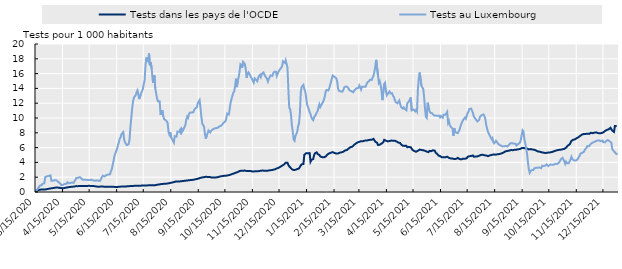
| Category | Tests dans les pays de l'OCDE | Tests au Luxembourg |
|---|---|---|
| 3/15/20 | 0.126 | 0.118 |
| 3/16/20 | 0.172 | 0.197 |
| 3/17/20 | 0.209 | 0.323 |
| 3/18/20 | 0.256 | 0.514 |
| 3/19/20 | 0.288 | 0.677 |
| 3/20/20 | 0.306 | 0.86 |
| 3/21/20 | 0.323 | 0.937 |
| 3/22/20 | 0.329 | 0.939 |
| 3/23/20 | 0.321 | 1.106 |
| 3/24/20 | 0.334 | 1.175 |
| 3/25/20 | 0.335 | 1.18 |
| 3/26/20 | 0.343 | 2.012 |
| 3/27/20 | 0.364 | 2.031 |
| 3/28/20 | 0.386 | 2.119 |
| 3/29/20 | 0.412 | 2.175 |
| 3/30/20 | 0.437 | 2.168 |
| 3/31/20 | 0.46 | 2.18 |
| 4/1/20 | 0.473 | 2.243 |
| 4/2/20 | 0.498 | 1.511 |
| 4/3/20 | 0.506 | 1.539 |
| 4/4/20 | 0.531 | 1.539 |
| 4/5/20 | 0.565 | 1.602 |
| 4/6/20 | 0.577 | 1.596 |
| 4/7/20 | 0.58 | 1.615 |
| 4/8/20 | 0.625 | 1.56 |
| 4/9/20 | 0.594 | 1.452 |
| 4/10/20 | 0.581 | 1.334 |
| 4/11/20 | 0.571 | 1.219 |
| 4/12/20 | 0.541 | 1.142 |
| 4/13/20 | 0.531 | 0.923 |
| 4/14/20 | 0.52 | 1.003 |
| 4/15/20 | 0.514 | 0.983 |
| 4/16/20 | 0.524 | 1.003 |
| 4/17/20 | 0.556 | 1.081 |
| 4/18/20 | 0.583 | 1.131 |
| 4/19/20 | 0.594 | 1.126 |
| 4/20/20 | 0.614 | 1.317 |
| 4/21/20 | 0.64 | 1.178 |
| 4/22/20 | 0.672 | 1.244 |
| 4/23/20 | 0.68 | 1.207 |
| 4/24/20 | 0.694 | 1.27 |
| 4/25/20 | 0.701 | 1.287 |
| 4/26/20 | 0.718 | 1.274 |
| 4/27/20 | 0.729 | 1.235 |
| 4/28/20 | 0.747 | 1.454 |
| 4/29/20 | 0.764 | 1.621 |
| 4/30/20 | 0.795 | 1.886 |
| 5/1/20 | 0.8 | 1.904 |
| 5/2/20 | 0.793 | 1.923 |
| 5/3/20 | 0.79 | 1.947 |
| 5/4/20 | 0.811 | 2.01 |
| 5/5/20 | 0.81 | 1.909 |
| 5/6/20 | 0.809 | 1.807 |
| 5/7/20 | 0.804 | 1.662 |
| 5/8/20 | 0.806 | 1.645 |
| 5/9/20 | 0.827 | 1.652 |
| 5/10/20 | 0.827 | 1.646 |
| 5/11/20 | 0.815 | 1.649 |
| 5/12/20 | 0.824 | 1.675 |
| 5/13/20 | 0.828 | 1.624 |
| 5/14/20 | 0.83 | 1.618 |
| 5/15/20 | 0.838 | 1.61 |
| 5/16/20 | 0.826 | 1.673 |
| 5/17/20 | 0.828 | 1.659 |
| 5/18/20 | 0.824 | 1.646 |
| 5/19/20 | 0.818 | 1.574 |
| 5/20/20 | 0.8 | 1.643 |
| 5/21/20 | 0.771 | 1.528 |
| 5/22/20 | 0.752 | 1.511 |
| 5/23/20 | 0.734 | 1.556 |
| 5/24/20 | 0.726 | 1.544 |
| 5/25/20 | 0.725 | 1.533 |
| 5/26/20 | 0.723 | 1.593 |
| 5/27/20 | 0.723 | 1.523 |
| 5/28/20 | 0.736 | 1.796 |
| 5/29/20 | 0.737 | 2.023 |
| 5/30/20 | 0.732 | 2.204 |
| 5/31/20 | 0.735 | 2.226 |
| 6/1/20 | 0.713 | 2.108 |
| 6/2/20 | 0.701 | 2.168 |
| 6/3/20 | 0.691 | 2.289 |
| 6/4/20 | 0.695 | 2.215 |
| 6/5/20 | 0.702 | 2.363 |
| 6/6/20 | 0.703 | 2.319 |
| 6/7/20 | 0.71 | 2.39 |
| 6/8/20 | 0.713 | 2.799 |
| 6/9/20 | 0.704 | 3.028 |
| 6/10/20 | 0.703 | 3.645 |
| 6/11/20 | 0.695 | 4.174 |
| 6/12/20 | 0.688 | 4.868 |
| 6/13/20 | 0.688 | 5.217 |
| 6/14/20 | 0.684 | 5.254 |
| 6/15/20 | 0.681 | 5.825 |
| 6/16/20 | 0.69 | 6.328 |
| 6/17/20 | 0.705 | 6.723 |
| 6/18/20 | 0.719 | 7.204 |
| 6/19/20 | 0.726 | 7.393 |
| 6/20/20 | 0.732 | 7.85 |
| 6/21/20 | 0.734 | 7.813 |
| 6/22/20 | 0.749 | 8.098 |
| 6/23/20 | 0.752 | 7.041 |
| 6/24/20 | 0.75 | 6.689 |
| 6/25/20 | 0.752 | 6.49 |
| 6/26/20 | 0.763 | 6.342 |
| 6/27/20 | 0.773 | 6.37 |
| 6/28/20 | 0.779 | 6.466 |
| 6/29/20 | 0.789 | 7.046 |
| 6/30/20 | 0.808 | 8.751 |
| 7/1/20 | 0.819 | 9.982 |
| 7/2/20 | 0.825 | 11.287 |
| 7/3/20 | 0.825 | 12.271 |
| 7/4/20 | 0.825 | 12.774 |
| 7/5/20 | 0.831 | 12.791 |
| 7/6/20 | 0.834 | 13.087 |
| 7/7/20 | 0.828 | 13.486 |
| 7/8/20 | 0.829 | 13.741 |
| 7/9/20 | 0.833 | 13.727 |
| 7/10/20 | 0.843 | 12.556 |
| 7/11/20 | 0.852 | 12.539 |
| 7/12/20 | 0.858 | 13.327 |
| 7/13/20 | 0.868 | 13.423 |
| 7/14/20 | 0.869 | 13.877 |
| 7/15/20 | 0.872 | 14.537 |
| 7/16/20 | 0.878 | 15.049 |
| 7/17/20 | 0.882 | 17.071 |
| 7/18/20 | 0.885 | 18.174 |
| 7/19/20 | 0.889 | 17.845 |
| 7/20/20 | 0.911 | 17.676 |
| 7/21/20 | 0.911 | 18.728 |
| 7/22/20 | 0.907 | 17.111 |
| 7/23/20 | 0.909 | 17.519 |
| 7/24/20 | 0.909 | 16.654 |
| 7/25/20 | 0.909 | 15.176 |
| 7/26/20 | 0.913 | 14.726 |
| 7/27/20 | 0.894 | 15.768 |
| 7/28/20 | 0.905 | 14.003 |
| 7/29/20 | 0.948 | 13.908 |
| 7/30/20 | 0.973 | 12.687 |
| 7/31/20 | 1 | 12.268 |
| 8/1/20 | 1.012 | 12.29 |
| 8/2/20 | 1.028 | 12.249 |
| 8/3/20 | 1.055 | 10.428 |
| 8/4/20 | 1.082 | 10.293 |
| 8/5/20 | 1.081 | 11.046 |
| 8/6/20 | 1.097 | 10.257 |
| 8/7/20 | 1.112 | 9.866 |
| 8/8/20 | 1.117 | 9.803 |
| 8/9/20 | 1.127 | 9.686 |
| 8/10/20 | 1.134 | 9.537 |
| 8/11/20 | 1.156 | 9.272 |
| 8/12/20 | 1.172 | 8.092 |
| 8/13/20 | 1.188 | 7.747 |
| 8/14/20 | 1.22 | 8.089 |
| 8/15/20 | 1.258 | 7.342 |
| 8/16/20 | 1.281 | 7.374 |
| 8/17/20 | 1.309 | 6.901 |
| 8/18/20 | 1.334 | 6.679 |
| 8/19/20 | 1.381 | 7.539 |
| 8/20/20 | 1.407 | 7.613 |
| 8/21/20 | 1.419 | 7.484 |
| 8/22/20 | 1.421 | 8.166 |
| 8/23/20 | 1.416 | 8.281 |
| 8/24/20 | 1.428 | 8.138 |
| 8/25/20 | 1.442 | 8.388 |
| 8/26/20 | 1.444 | 7.796 |
| 8/27/20 | 1.469 | 8.503 |
| 8/28/20 | 1.482 | 8.287 |
| 8/29/20 | 1.5 | 8.525 |
| 8/30/20 | 1.51 | 8.514 |
| 8/31/20 | 1.536 | 9.069 |
| 9/1/20 | 1.541 | 9.819 |
| 9/2/20 | 1.557 | 10.186 |
| 9/3/20 | 1.572 | 10.025 |
| 9/4/20 | 1.593 | 10.554 |
| 9/5/20 | 1.603 | 10.721 |
| 9/6/20 | 1.614 | 10.765 |
| 9/7/20 | 1.619 | 10.743 |
| 9/8/20 | 1.644 | 10.743 |
| 9/9/20 | 1.659 | 10.783 |
| 9/10/20 | 1.677 | 11.113 |
| 9/11/20 | 1.711 | 11.287 |
| 9/12/20 | 1.743 | 11.391 |
| 9/13/20 | 1.769 | 11.449 |
| 9/14/20 | 1.797 | 12.03 |
| 9/15/20 | 1.824 | 12.147 |
| 9/16/20 | 1.862 | 12.421 |
| 9/17/20 | 1.912 | 11.373 |
| 9/18/20 | 1.95 | 10.179 |
| 9/19/20 | 1.97 | 9.244 |
| 9/20/20 | 1.984 | 9.116 |
| 9/21/20 | 2.009 | 8.823 |
| 9/22/20 | 2.05 | 7.834 |
| 9/23/20 | 2.058 | 7.193 |
| 9/24/20 | 2.05 | 7.615 |
| 9/25/20 | 2.037 | 7.931 |
| 9/26/20 | 2.045 | 8.3 |
| 9/27/20 | 2.042 | 8.272 |
| 9/28/20 | 2.009 | 8.046 |
| 9/29/20 | 1.976 | 8.261 |
| 9/30/20 | 1.983 | 8.247 |
| 10/1/20 | 1.968 | 8.476 |
| 10/2/20 | 1.964 | 8.554 |
| 10/3/20 | 1.949 | 8.601 |
| 10/4/20 | 1.945 | 8.669 |
| 10/5/20 | 1.98 | 8.637 |
| 10/6/20 | 2.001 | 8.533 |
| 10/7/20 | 2.019 | 8.714 |
| 10/8/20 | 2.067 | 8.859 |
| 10/9/20 | 2.102 | 8.981 |
| 10/10/20 | 2.128 | 8.929 |
| 10/11/20 | 2.139 | 8.88 |
| 10/12/20 | 2.16 | 9.184 |
| 10/13/20 | 2.179 | 9.363 |
| 10/14/20 | 2.195 | 9.344 |
| 10/15/20 | 2.192 | 9.552 |
| 10/16/20 | 2.201 | 9.842 |
| 10/17/20 | 2.228 | 10.595 |
| 10/18/20 | 2.257 | 10.652 |
| 10/19/20 | 2.279 | 10.487 |
| 10/20/20 | 2.313 | 10.562 |
| 10/21/20 | 2.346 | 12.123 |
| 10/22/20 | 2.398 | 12.189 |
| 10/23/20 | 2.447 | 13.023 |
| 10/24/20 | 2.482 | 13.415 |
| 10/25/20 | 2.516 | 13.607 |
| 10/26/20 | 2.56 | 14.28 |
| 10/27/20 | 2.62 | 15.315 |
| 10/28/20 | 2.66 | 14.177 |
| 10/29/20 | 2.693 | 15.034 |
| 10/30/20 | 2.753 | 15.518 |
| 10/31/20 | 2.835 | 16.227 |
| 11/1/20 | 2.864 | 17.249 |
| 11/2/20 | 2.878 | 17.111 |
| 11/3/20 | 2.878 | 16.795 |
| 11/4/20 | 2.886 | 17.591 |
| 11/5/20 | 2.885 | 17.537 |
| 11/6/20 | 2.89 | 17.293 |
| 11/7/20 | 2.86 | 16.619 |
| 11/8/20 | 2.845 | 15.414 |
| 11/9/20 | 2.848 | 15.987 |
| 11/10/20 | 2.854 | 16.167 |
| 11/11/20 | 2.842 | 16 |
| 11/12/20 | 2.853 | 15.979 |
| 11/13/20 | 2.83 | 15.494 |
| 11/14/20 | 2.786 | 15.299 |
| 11/15/20 | 2.781 | 15.236 |
| 11/16/20 | 2.782 | 14.785 |
| 11/17/20 | 2.776 | 15.349 |
| 11/18/20 | 2.802 | 15.256 |
| 11/19/20 | 2.799 | 15.11 |
| 11/20/20 | 2.805 | 14.971 |
| 11/21/20 | 2.822 | 15.434 |
| 11/22/20 | 2.828 | 15.677 |
| 11/23/20 | 2.857 | 15.831 |
| 11/24/20 | 2.878 | 15.523 |
| 11/25/20 | 2.883 | 15.934 |
| 11/26/20 | 2.895 | 15.855 |
| 11/27/20 | 2.883 | 16.159 |
| 11/28/20 | 2.88 | 15.876 |
| 11/29/20 | 2.867 | 15.647 |
| 11/30/20 | 2.864 | 15.592 |
| 12/1/20 | 2.862 | 15.29 |
| 12/2/20 | 2.882 | 14.929 |
| 12/3/20 | 2.903 | 15.307 |
| 12/4/20 | 2.936 | 15.439 |
| 12/5/20 | 2.941 | 15.757 |
| 12/6/20 | 2.958 | 15.738 |
| 12/7/20 | 2.973 | 15.696 |
| 12/8/20 | 3.005 | 16.052 |
| 12/9/20 | 3.033 | 16.236 |
| 12/10/20 | 3.074 | 16.145 |
| 12/11/20 | 3.135 | 16.255 |
| 12/12/20 | 3.185 | 15.694 |
| 12/13/20 | 3.217 | 15.814 |
| 12/14/20 | 3.268 | 16.299 |
| 12/15/20 | 3.35 | 16.474 |
| 12/16/20 | 3.416 | 16.638 |
| 12/17/20 | 3.481 | 16.709 |
| 12/18/20 | 3.555 | 16.972 |
| 12/19/20 | 3.627 | 17.676 |
| 12/20/20 | 3.707 | 17.61 |
| 12/21/20 | 3.837 | 17.454 |
| 12/22/20 | 3.957 | 17.81 |
| 12/23/20 | 4.068 | 17.712 |
| 12/24/20 | 3.955 | 16.827 |
| 12/25/20 | 3.656 | 13.949 |
| 12/26/20 | 3.471 | 11.384 |
| 12/27/20 | 3.35 | 11.222 |
| 12/28/20 | 3.217 | 10.466 |
| 12/29/20 | 3.077 | 8.973 |
| 12/30/20 | 2.959 | 8.13 |
| 12/31/20 | 2.966 | 7.093 |
| 1/1/21 | 2.954 | 6.931 |
| 1/2/21 | 2.999 | 7.568 |
| 1/3/21 | 3.033 | 7.638 |
| 1/4/21 | 3.104 | 8.128 |
| 1/5/21 | 3.17 | 8.892 |
| 1/6/21 | 3.174 | 9.233 |
| 1/7/21 | 3.281 | 10.652 |
| 1/8/21 | 3.593 | 13.387 |
| 1/9/21 | 3.736 | 14.215 |
| 1/10/21 | 3.79 | 14.22 |
| 1/11/21 | 3.788 | 14.466 |
| 1/12/21 | 5.02 | 13.908 |
| 1/13/21 | 5.078 | 13.628 |
| 1/14/21 | 5.241 | 12.864 |
| 1/15/21 | 5.235 | 11.871 |
| 1/16/21 | 5.23 | 11.536 |
| 1/17/21 | 5.23 | 11.54 |
| 1/18/21 | 5.257 | 10.798 |
| 1/19/21 | 4.098 | 10.51 |
| 1/20/21 | 4.351 | 10.085 |
| 1/21/21 | 4.307 | 9.864 |
| 1/22/21 | 4.448 | 9.71 |
| 1/23/21 | 4.967 | 10.08 |
| 1/24/21 | 5.226 | 9.995 |
| 1/25/21 | 5.327 | 10.466 |
| 1/26/21 | 5.359 | 10.761 |
| 1/27/21 | 5.127 | 10.918 |
| 1/28/21 | 5.07 | 11.474 |
| 1/29/21 | 5.005 | 11.854 |
| 1/30/21 | 4.807 | 11.487 |
| 1/31/21 | 4.712 | 11.548 |
| 2/1/21 | 4.713 | 11.947 |
| 2/2/21 | 4.665 | 12.123 |
| 2/3/21 | 4.691 | 12.487 |
| 2/4/21 | 4.724 | 12.842 |
| 2/5/21 | 4.784 | 13.555 |
| 2/6/21 | 4.919 | 13.798 |
| 2/7/21 | 5.058 | 13.813 |
| 2/8/21 | 5.108 | 13.711 |
| 2/9/21 | 5.218 | 13.963 |
| 2/10/21 | 5.258 | 14.439 |
| 2/11/21 | 5.31 | 14.834 |
| 2/12/21 | 5.383 | 15.33 |
| 2/13/21 | 5.389 | 15.734 |
| 2/14/21 | 5.314 | 15.813 |
| 2/15/21 | 5.269 | 15.559 |
| 2/16/21 | 5.225 | 15.641 |
| 2/17/21 | 5.199 | 15.368 |
| 2/18/21 | 5.211 | 14.97 |
| 2/19/21 | 5.213 | 13.974 |
| 2/20/21 | 5.275 | 13.684 |
| 2/21/21 | 5.32 | 13.558 |
| 2/22/21 | 5.324 | 13.59 |
| 2/23/21 | 5.36 | 13.673 |
| 2/24/21 | 5.4 | 13.561 |
| 2/25/21 | 5.45 | 13.809 |
| 2/26/21 | 5.531 | 14.141 |
| 2/27/21 | 5.618 | 14.236 |
| 2/28/21 | 5.627 | 14.278 |
| 3/1/21 | 5.673 | 14.258 |
| 3/2/21 | 5.782 | 14.133 |
| 3/3/21 | 5.878 | 14.214 |
| 3/4/21 | 5.965 | 13.747 |
| 3/5/21 | 6.057 | 13.736 |
| 3/6/21 | 6.072 | 13.631 |
| 3/7/21 | 6.123 | 13.631 |
| 3/8/21 | 6.254 | 13.484 |
| 3/9/21 | 6.359 | 13.602 |
| 3/10/21 | 6.477 | 13.823 |
| 3/11/21 | 6.546 | 13.946 |
| 3/12/21 | 6.666 | 14.017 |
| 3/13/21 | 6.701 | 14.077 |
| 3/14/21 | 6.744 | 14.069 |
| 3/15/21 | 6.781 | 14.399 |
| 3/16/21 | 6.788 | 14.158 |
| 3/17/21 | 6.872 | 13.85 |
| 3/18/21 | 6.919 | 14.228 |
| 3/19/21 | 6.864 | 14.099 |
| 3/20/21 | 6.867 | 14.228 |
| 3/21/21 | 6.94 | 14.289 |
| 3/22/21 | 6.944 | 14.226 |
| 3/23/21 | 6.952 | 14.346 |
| 3/24/21 | 6.93 | 14.814 |
| 3/25/21 | 7.001 | 14.79 |
| 3/26/21 | 7.114 | 14.984 |
| 3/27/21 | 7.059 | 15.167 |
| 3/28/21 | 7.055 | 15.089 |
| 3/29/21 | 7.059 | 15.151 |
| 3/30/21 | 7.121 | 15.49 |
| 3/31/21 | 7.179 | 15.732 |
| 4/1/21 | 7.181 | 16.274 |
| 4/2/21 | 6.798 | 16.999 |
| 4/3/21 | 6.832 | 17.857 |
| 4/4/21 | 6.659 | 17.977 |
| 4/5/21 | 6.351 | 15.778 |
| 4/6/21 | 6.351 | 14.749 |
| 4/7/21 | 6.392 | 14.976 |
| 4/8/21 | 6.324 | 14.491 |
| 4/9/21 | 6.542 | 13.64 |
| 4/10/21 | 6.58 | 12.416 |
| 4/11/21 | 6.73 | 12.29 |
| 4/12/21 | 7.043 | 14.601 |
| 4/13/21 | 6.98 | 14.762 |
| 4/14/21 | 6.933 | 13.673 |
| 4/15/21 | 6.865 | 13.075 |
| 4/16/21 | 6.843 | 13.264 |
| 4/17/21 | 6.844 | 13.322 |
| 4/18/21 | 6.882 | 13.582 |
| 4/19/21 | 6.931 | 13.322 |
| 4/20/21 | 6.952 | 13.372 |
| 4/21/21 | 6.87 | 13.352 |
| 4/22/21 | 6.934 | 12.983 |
| 4/23/21 | 6.981 | 12.837 |
| 4/24/21 | 6.938 | 12.404 |
| 4/25/21 | 6.903 | 12.148 |
| 4/26/21 | 6.826 | 12.189 |
| 4/27/21 | 6.796 | 11.986 |
| 4/28/21 | 6.677 | 12.096 |
| 4/29/21 | 6.663 | 12.363 |
| 4/30/21 | 6.625 | 12.363 |
| 5/1/21 | 6.438 | 11.488 |
| 5/2/21 | 6.318 | 11.454 |
| 5/3/21 | 6.253 | 11.276 |
| 5/4/21 | 6.181 | 11.413 |
| 5/5/21 | 6.23 | 11.243 |
| 5/6/21 | 6.287 | 11.263 |
| 5/7/21 | 6.241 | 11.054 |
| 5/8/21 | 6.051 | 11.997 |
| 5/9/21 | 6.066 | 12.021 |
| 5/10/21 | 6.08 | 12.251 |
| 5/11/21 | 6.068 | 12.161 |
| 5/12/21 | 6.05 | 12.769 |
| 5/13/21 | 5.841 | 11.025 |
| 5/14/21 | 5.68 | 10.929 |
| 5/15/21 | 5.631 | 11.153 |
| 5/16/21 | 5.523 | 11.188 |
| 5/17/21 | 5.47 | 10.898 |
| 5/18/21 | 5.439 | 11.099 |
| 5/19/21 | 5.465 | 10.885 |
| 5/20/21 | 5.567 | 13.902 |
| 5/21/21 | 5.699 | 15.296 |
| 5/22/21 | 5.732 | 16.142 |
| 5/23/21 | 5.751 | 16.228 |
| 5/24/21 | 5.681 | 14.36 |
| 5/25/21 | 5.678 | 14.114 |
| 5/26/21 | 5.635 | 13.958 |
| 5/27/21 | 5.653 | 12.824 |
| 5/28/21 | 5.566 | 11.32 |
| 5/29/21 | 5.501 | 10.156 |
| 5/30/21 | 5.457 | 10.012 |
| 5/31/21 | 5.467 | 12.07 |
| 6/1/21 | 5.387 | 11.58 |
| 6/2/21 | 5.555 | 10.947 |
| 6/3/21 | 5.548 | 10.718 |
| 6/4/21 | 5.517 | 10.687 |
| 6/5/21 | 5.612 | 10.647 |
| 6/6/21 | 5.637 | 10.638 |
| 6/7/21 | 5.635 | 10.359 |
| 6/8/21 | 5.584 | 10.274 |
| 6/9/21 | 5.314 | 10.323 |
| 6/10/21 | 5.193 | 10.242 |
| 6/11/21 | 5.114 | 10.288 |
| 6/12/21 | 4.941 | 10.279 |
| 6/13/21 | 4.898 | 10.294 |
| 6/14/21 | 4.848 | 10.093 |
| 6/15/21 | 4.779 | 10.285 |
| 6/16/21 | 4.693 | 10.274 |
| 6/17/21 | 4.657 | 10.034 |
| 6/18/21 | 4.705 | 10.447 |
| 6/19/21 | 4.706 | 10.438 |
| 6/20/21 | 4.686 | 10.433 |
| 6/21/21 | 4.676 | 10.439 |
| 6/22/21 | 4.772 | 10.824 |
| 6/23/21 | 4.757 | 9.349 |
| 6/24/21 | 4.609 | 9.595 |
| 6/25/21 | 4.559 | 8.993 |
| 6/26/21 | 4.526 | 8.833 |
| 6/27/21 | 4.49 | 8.817 |
| 6/28/21 | 4.523 | 8.582 |
| 6/29/21 | 4.424 | 7.575 |
| 6/30/21 | 4.447 | 8.617 |
| 7/1/21 | 4.519 | 8.174 |
| 7/2/21 | 4.481 | 8.029 |
| 7/3/21 | 4.49 | 7.946 |
| 7/4/21 | 4.61 | 7.96 |
| 7/5/21 | 4.502 | 7.831 |
| 7/6/21 | 4.446 | 8.431 |
| 7/7/21 | 4.409 | 8.872 |
| 7/8/21 | 4.41 | 9.203 |
| 7/9/21 | 4.452 | 9.502 |
| 7/10/21 | 4.509 | 9.746 |
| 7/11/21 | 4.442 | 9.745 |
| 7/12/21 | 4.489 | 10.053 |
| 7/13/21 | 4.551 | 9.888 |
| 7/14/21 | 4.555 | 10.263 |
| 7/15/21 | 4.748 | 10.669 |
| 7/16/21 | 4.801 | 10.852 |
| 7/17/21 | 4.84 | 11.221 |
| 7/18/21 | 4.858 | 11.225 |
| 7/19/21 | 4.862 | 11.271 |
| 7/20/21 | 4.912 | 11.254 |
| 7/21/21 | 4.936 | 10.693 |
| 7/22/21 | 4.77 | 10.197 |
| 7/23/21 | 4.784 | 10.038 |
| 7/24/21 | 4.796 | 9.853 |
| 7/25/21 | 4.792 | 9.842 |
| 7/26/21 | 4.811 | 9.541 |
| 7/27/21 | 4.816 | 9.521 |
| 7/28/21 | 4.898 | 9.734 |
| 7/29/21 | 4.923 | 10.168 |
| 7/30/21 | 5.013 | 10.288 |
| 7/31/21 | 5.024 | 10.411 |
| 8/1/21 | 5.023 | 10.406 |
| 8/2/21 | 5.016 | 10.476 |
| 8/3/21 | 4.961 | 10.258 |
| 8/4/21 | 4.904 | 9.853 |
| 8/5/21 | 4.939 | 9.033 |
| 8/6/21 | 4.844 | 8.574 |
| 8/7/21 | 4.839 | 8.114 |
| 8/8/21 | 4.897 | 8.106 |
| 8/9/21 | 4.942 | 7.643 |
| 8/10/21 | 4.994 | 7.613 |
| 8/11/21 | 5.005 | 7.139 |
| 8/12/21 | 5.044 | 7.287 |
| 8/13/21 | 5.064 | 6.734 |
| 8/14/21 | 5.076 | 6.577 |
| 8/15/21 | 5.046 | 6.58 |
| 8/16/21 | 5.066 | 6.931 |
| 8/17/21 | 5.082 | 6.756 |
| 8/18/21 | 5.104 | 6.851 |
| 8/19/21 | 5.118 | 6.44 |
| 8/20/21 | 5.135 | 6.473 |
| 8/21/21 | 5.162 | 6.309 |
| 8/22/21 | 5.192 | 6.325 |
| 8/23/21 | 5.252 | 6.156 |
| 8/24/21 | 5.306 | 6.121 |
| 8/25/21 | 5.372 | 6.178 |
| 8/26/21 | 5.438 | 6.213 |
| 8/27/21 | 5.507 | 6.218 |
| 8/28/21 | 5.55 | 6.188 |
| 8/29/21 | 5.553 | 6.155 |
| 8/30/21 | 5.526 | 6.227 |
| 8/31/21 | 5.596 | 6.414 |
| 9/1/21 | 5.686 | 6.57 |
| 9/2/21 | 5.667 | 6.626 |
| 9/3/21 | 5.648 | 6.605 |
| 9/4/21 | 5.652 | 6.534 |
| 9/5/21 | 5.66 | 6.539 |
| 9/6/21 | 5.706 | 6.671 |
| 9/7/21 | 5.69 | 6.525 |
| 9/8/21 | 5.718 | 6.29 |
| 9/9/21 | 5.718 | 6.359 |
| 9/10/21 | 5.772 | 6.479 |
| 9/11/21 | 5.79 | 6.583 |
| 9/12/21 | 5.806 | 6.668 |
| 9/13/21 | 5.807 | 7.024 |
| 9/14/21 | 5.933 | 7.711 |
| 9/15/21 | 5.93 | 8.339 |
| 9/16/21 | 5.951 | 8.177 |
| 9/17/21 | 5.915 | 7.076 |
| 9/18/21 | 5.899 | 6.599 |
| 9/19/21 | 5.91 | 6.525 |
| 9/20/21 | 5.88 | 5.194 |
| 9/21/21 | 5.774 | 4.007 |
| 9/22/21 | 5.755 | 3.084 |
| 9/23/21 | 5.781 | 2.591 |
| 9/24/21 | 5.797 | 2.798 |
| 9/25/21 | 5.762 | 2.952 |
| 9/26/21 | 5.741 | 2.955 |
| 9/27/21 | 5.693 | 2.969 |
| 9/28/21 | 5.714 | 3.179 |
| 9/29/21 | 5.671 | 3.232 |
| 9/30/21 | 5.62 | 3.278 |
| 10/1/21 | 5.569 | 3.362 |
| 10/2/21 | 5.486 | 3.289 |
| 10/3/21 | 5.486 | 3.291 |
| 10/4/21 | 5.455 | 3.305 |
| 10/5/21 | 5.421 | 3.177 |
| 10/6/21 | 5.377 | 3.225 |
| 10/7/21 | 5.345 | 3.543 |
| 10/8/21 | 5.328 | 3.499 |
| 10/9/21 | 5.325 | 3.507 |
| 10/10/21 | 5.282 | 3.499 |
| 10/11/21 | 5.282 | 3.595 |
| 10/12/21 | 5.288 | 3.735 |
| 10/13/21 | 5.299 | 3.754 |
| 10/14/21 | 5.33 | 3.492 |
| 10/15/21 | 5.32 | 3.601 |
| 10/16/21 | 5.35 | 3.702 |
| 10/17/21 | 5.369 | 3.708 |
| 10/18/21 | 5.404 | 3.697 |
| 10/19/21 | 5.45 | 3.744 |
| 10/20/21 | 5.488 | 3.692 |
| 10/21/21 | 5.53 | 3.738 |
| 10/22/21 | 5.575 | 3.825 |
| 10/23/21 | 5.623 | 3.744 |
| 10/24/21 | 5.643 | 3.77 |
| 10/25/21 | 5.646 | 3.881 |
| 10/26/21 | 5.697 | 3.985 |
| 10/27/21 | 5.711 | 4.14 |
| 10/28/21 | 5.723 | 4.423 |
| 10/29/21 | 5.725 | 4.438 |
| 10/30/21 | 5.775 | 4.616 |
| 10/31/21 | 5.862 | 4.647 |
| 11/1/21 | 5.826 | 4.141 |
| 11/2/21 | 5.801 | 3.804 |
| 11/3/21 | 5.996 | 4.093 |
| 11/4/21 | 6.091 | 3.894 |
| 11/5/21 | 6.273 | 3.913 |
| 11/6/21 | 6.359 | 3.878 |
| 11/7/21 | 6.438 | 3.897 |
| 11/8/21 | 6.642 | 4.392 |
| 11/9/21 | 6.908 | 4.746 |
| 11/10/21 | 6.886 | 4.442 |
| 11/11/21 | 7.056 | 4.445 |
| 11/12/21 | 7.094 | 4.278 |
| 11/13/21 | 7.116 | 4.253 |
| 11/14/21 | 7.127 | 4.26 |
| 11/15/21 | 7.274 | 4.239 |
| 11/16/21 | 7.256 | 4.417 |
| 11/17/21 | 7.408 | 4.655 |
| 11/18/21 | 7.446 | 4.841 |
| 11/19/21 | 7.601 | 5.143 |
| 11/20/21 | 7.691 | 5.271 |
| 11/21/21 | 7.765 | 5.298 |
| 11/22/21 | 7.751 | 5.38 |
| 11/23/21 | 7.85 | 5.417 |
| 11/24/21 | 7.807 | 5.677 |
| 11/25/21 | 7.852 | 5.772 |
| 11/26/21 | 7.92 | 5.995 |
| 11/27/21 | 7.886 | 6.211 |
| 11/28/21 | 7.852 | 6.175 |
| 11/29/21 | 7.852 | 6.178 |
| 11/30/21 | 7.932 | 6.399 |
| 12/1/21 | 8.007 | 6.471 |
| 12/2/21 | 7.992 | 6.61 |
| 12/3/21 | 7.949 | 6.69 |
| 12/4/21 | 8.026 | 6.739 |
| 12/5/21 | 8.02 | 6.813 |
| 12/6/21 | 8.048 | 6.835 |
| 12/7/21 | 8.058 | 6.761 |
| 12/8/21 | 8.03 | 6.945 |
| 12/9/21 | 7.958 | 6.859 |
| 12/10/21 | 7.976 | 6.972 |
| 12/11/21 | 7.932 | 6.915 |
| 12/12/21 | 7.936 | 6.871 |
| 12/13/21 | 7.964 | 6.837 |
| 12/14/21 | 7.924 | 6.953 |
| 12/15/21 | 8.06 | 6.714 |
| 12/16/21 | 8.173 | 6.745 |
| 12/17/21 | 8.252 | 6.719 |
| 12/18/21 | 8.354 | 6.874 |
| 12/19/21 | 8.397 | 6.958 |
| 12/20/21 | 8.43 | 7.032 |
| 12/21/21 | 8.469 | 6.937 |
| 12/22/21 | 8.585 | 6.857 |
| 12/23/21 | 8.68 | 6.903 |
| 12/24/21 | 8.563 | 6.674 |
| 12/25/21 | 8.305 | 5.803 |
| 12/26/21 | 8.209 | 5.643 |
| 12/27/21 | 8.119 | 5.595 |
| 12/28/21 | 8.907 | 5.361 |
| 12/29/21 | 8.824 | 5.203 |
| 12/30/21 | 8.919 | 5.098 |
| 12/31/21 | 9.017 | 5.087 |